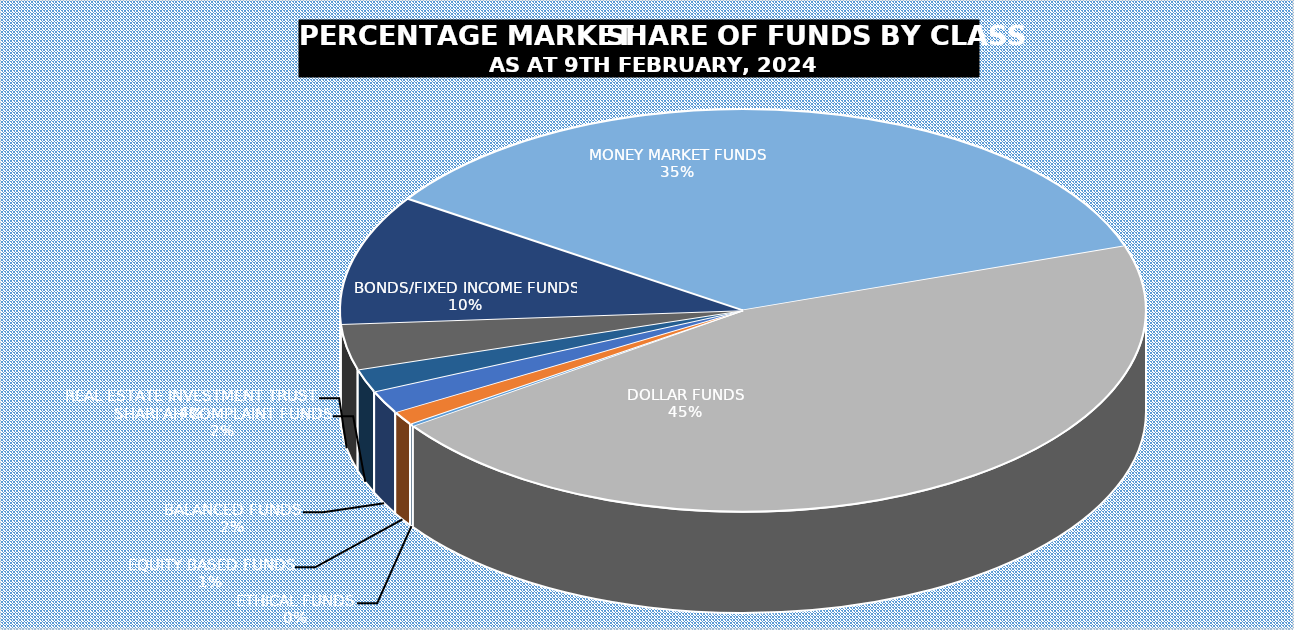
| Category | 9-Feb |
|---|---|
| ETHICAL FUNDS | 5371622450.7 |
| EQUITY BASED FUNDS | 29773154676.33 |
| BALANCED FUNDS | 49899185767.631 |
| SHARI'AH COMPLAINT FUNDS | 50580214127.422 |
| REAL ESTATE INVESTMENT TRUST | 99671501901.347 |
| BONDS/FIXED INCOME FUNDS | 284109657368.597 |
| MONEY MARKET FUNDS | 965954238325.49 |
| DOLLAR FUNDS | 1237172786827.97 |